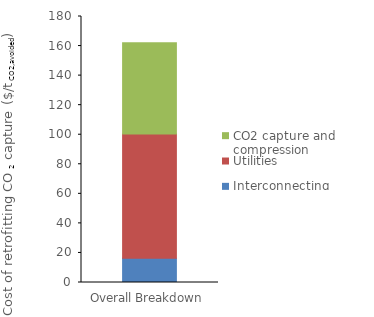
| Category | Interconnecting | Utilities | CO2 capture and compression |
|---|---|---|---|
| 0 | 16.444 | 84.084 | 61.667 |